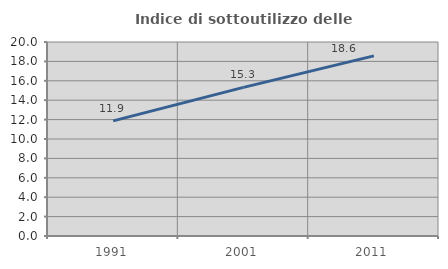
| Category | Indice di sottoutilizzo delle abitazioni  |
|---|---|
| 1991.0 | 11.872 |
| 2001.0 | 15.326 |
| 2011.0 | 18.569 |